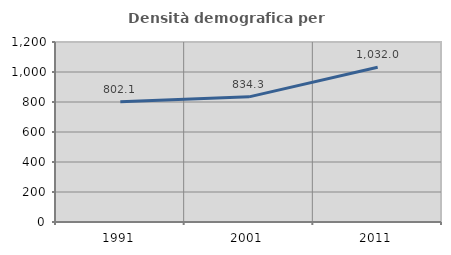
| Category | Densità demografica |
|---|---|
| 1991.0 | 802.144 |
| 2001.0 | 834.259 |
| 2011.0 | 1032.018 |